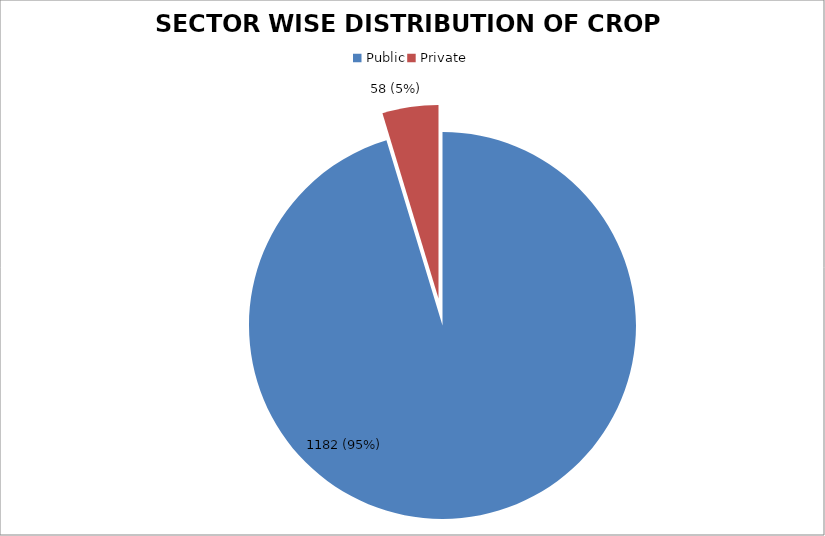
| Category | Series 0 |
|---|---|
| Public | 1182 |
| Private | 58 |